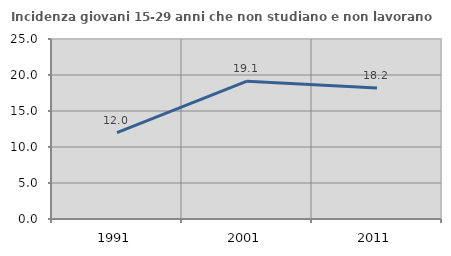
| Category | Incidenza giovani 15-29 anni che non studiano e non lavorano  |
|---|---|
| 1991.0 | 12.011 |
| 2001.0 | 19.149 |
| 2011.0 | 18.182 |